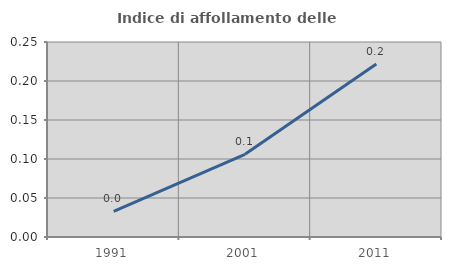
| Category | Indice di affollamento delle abitazioni  |
|---|---|
| 1991.0 | 0.033 |
| 2001.0 | 0.106 |
| 2011.0 | 0.222 |